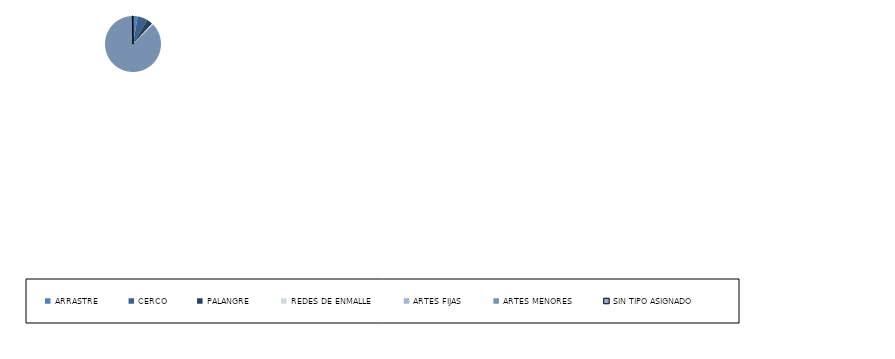
| Category | Series 0 |
|---|---|
| ARRASTRE | 7 |
| CERCO | 15 |
| PALANGRE | 9 |
| REDES DE ENMALLE | 2 |
| ARTES FIJAS | 0 |
| ARTES MENORES | 225 |
| SIN TIPO ASIGNADO | 1 |